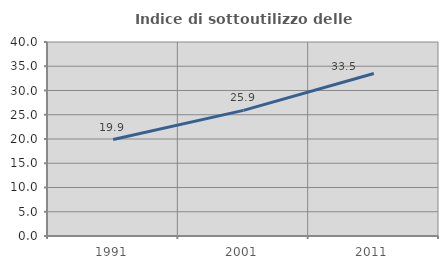
| Category | Indice di sottoutilizzo delle abitazioni  |
|---|---|
| 1991.0 | 19.894 |
| 2001.0 | 25.908 |
| 2011.0 | 33.505 |